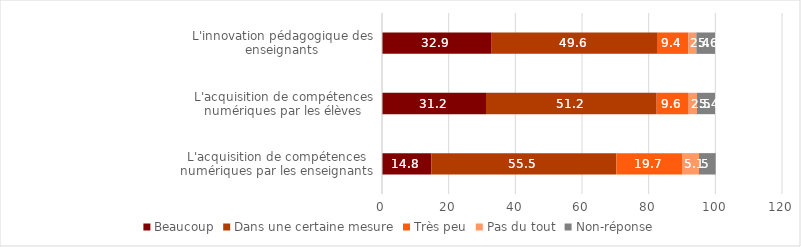
| Category | Beaucoup | Dans une certaine mesure | Très peu | Pas du tout | Non-réponse |
|---|---|---|---|---|---|
| L'acquisition de compétences numériques par les enseignants | 14.8 | 55.5 | 19.7 | 5.1 | 5 |
| L'acquisition de compétences numériques par les élèves | 31.2 | 51.2 | 9.6 | 2.5 | 5.4 |
| L'innovation pédagogique des enseignants | 32.9 | 49.6 | 9.4 | 2.4 | 5.6 |